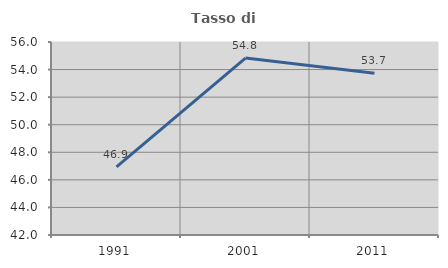
| Category | Tasso di occupazione   |
|---|---|
| 1991.0 | 46.939 |
| 2001.0 | 54.831 |
| 2011.0 | 53.737 |